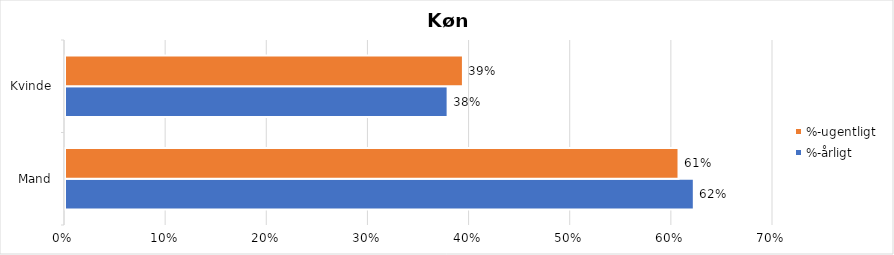
| Category | %-årligt | %-ugentligt |
|---|---|---|
| Mand | 0.622 | 0.607 |
| Kvinde | 0.378 | 0.393 |